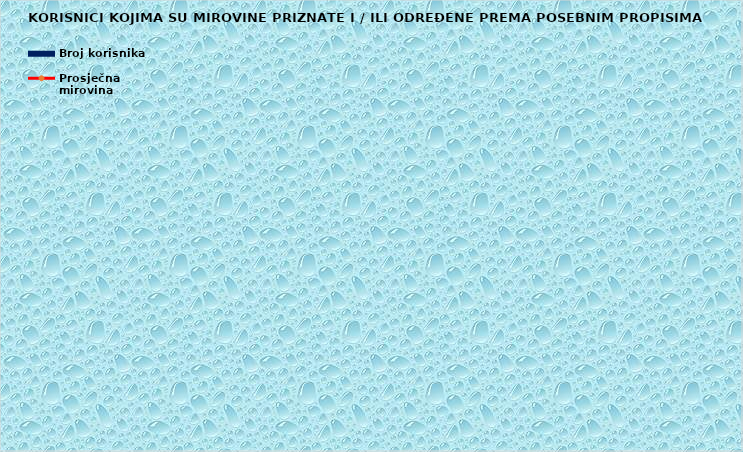
| Category | Broj korisnika |
|---|---|
|      a) radnici na poslovima ovlaštenih službenih osoba u tijelima unutarnjih 
poslova i pravosuđa, kojima je pravo na mirovinu priznato prema propisima
koji su bili na snazi do stupanja na snagu Zakona o pravima iz mirovinskog
osiguranja DVO, PS i OSO | 8221 |
|      b) radnici na  poslovima policijskih službenika, ovlaštenih službenih osoba pravosuđa i službene osobe s posebnim dužnostima i ovlastima u sigurnosno obavještajnom sustavu RH koji su pravo na mirovinu ostvarili prema Zakonu o pravima DVO, PS i OSO | 8646 |
|      c) radnici na poslovima razminiranja | 595 |
| Korisnici koji pravo na mirovinu ostvaruju prema Zakonu o vatrogastvu (NN 125/19)* | 68 |
| Djelatne vojne osobe - DVO  | 15866 |
| Pripadnici Hrvatske domovinske vojske od 1941. do 1945. godine | 3345 |
| Bivši politički zatvorenici | 2623 |
| Hrvatski branitelji iz Domovinskog rata - ZOHBDR | 71031 |
| Mirovine priznate prema općim propisima, a određene prema
ZOHBDR - u iz 2017. (čl. 27., 35., 48. i 49. stavak 2.)  | 46832 |
| Pripadnici bivše Jugoslavenske narodne armije - JNA | 4924 |
| Pripadnici bivše Jugoslavenske narodne armije - JNA - čl. 185 ZOMO | 159 |
| Sudionici Narodnooslobodilačkog rata - NOR | 8164 |
| Zastupnici u Hrvatskom saboru, članovi Vlade, suci Ustavnog suda i glavni državni revizor  | 682 |
| Članovi Izvršnog vijeća Sabora, Saveznog izvršnog vijeća i administrativno umirovljeni javni službenici | 87 |
| Bivši službenici u saveznim tijelima bivše SFRJ - članak 38. ZOMO | 31 |
| Redoviti članovi Hrvatske akademije znanosti i umjetnosti - HAZU | 137 |
| Radnici u Istarskim ugljenokopima "Tupljak" d.d. Labin  | 251 |
| Radnici profesionalno izloženi azbestu | 861 |
| Osiguranici - članovi posade broda u međunarodnoj plovidbi i nacionalnoj plovidbi - članak 129. a stavak 2. Pomorskog zakonika | 191 |
| Pripadnici Hrvatskog vijeća obrane  - HVO  | 6778 |